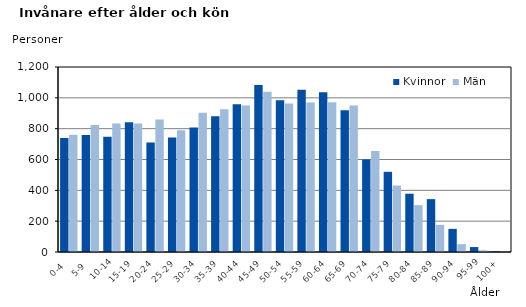
| Category | Kvinnor | Män |
|---|---|---|
|   0-4  | 739 | 761 |
|   5-9  | 759 | 824 |
| 10-14 | 748 | 834 |
| 15-19  | 842 | 834 |
| 20-24  | 711 | 859 |
| 25-29  | 743 | 790 |
| 30-34  | 808 | 904 |
| 35-39  | 881 | 926 |
| 40-44  | 959 | 951 |
| 45-49  | 1084 | 1039 |
| 50-54  | 985 | 964 |
| 55-59  | 1052 | 970 |
| 60-64  | 1037 | 971 |
| 65-69  | 920 | 950 |
| 70-74  | 600 | 655 |
| 75-79  | 520 | 431 |
| 80-84  | 378 | 304 |
| 85-89  | 343 | 176 |
| 90-94  | 150 | 51 |
| 95-99 | 32 | 11 |
| 100+ | 4 | 2 |